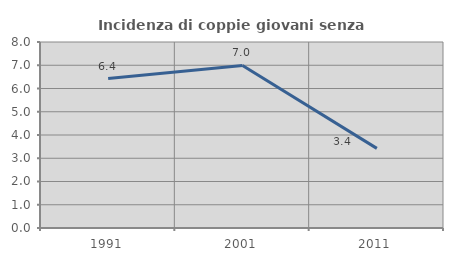
| Category | Incidenza di coppie giovani senza figli |
|---|---|
| 1991.0 | 6.426 |
| 2001.0 | 6.993 |
| 2011.0 | 3.425 |